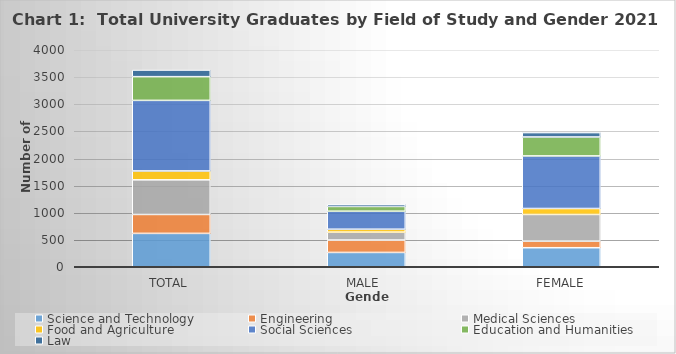
| Category | Science and Technology | Engineering | Medical Sciences | Food and Agriculture | Social Sciences | Education and Humanities | Law |
|---|---|---|---|---|---|---|---|
| Total  | 615 | 349 | 638 | 164 | 1301 | 437 | 122 |
| Male  | 264 | 228 | 146 | 54 | 332 | 88 | 41 |
| Female | 351 | 121 | 492 | 110 | 969 | 349 | 81 |